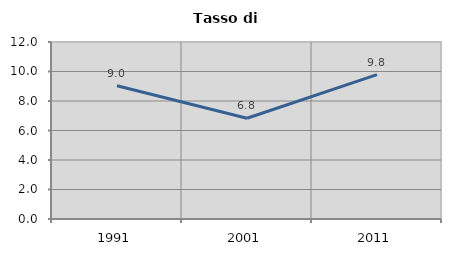
| Category | Tasso di disoccupazione   |
|---|---|
| 1991.0 | 9.034 |
| 2001.0 | 6.831 |
| 2011.0 | 9.79 |